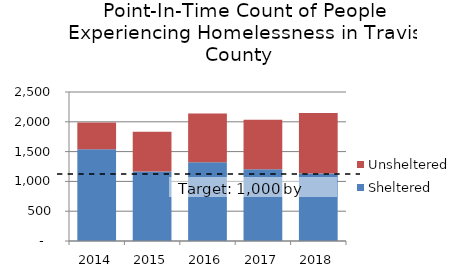
| Category | Sheltered | Unsheltered |
|---|---|---|
| 2014.0 | 1539 | 448 |
| 2015.0 | 1165 | 667 |
| 2016.0 | 1322 | 816 |
| 2017.0 | 1202 | 834 |
| 2018.0 | 1133 | 1014 |